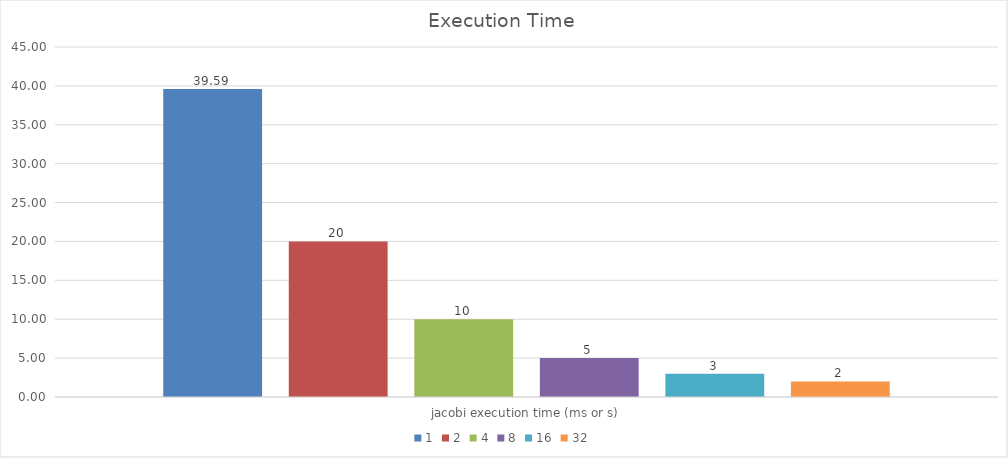
| Category | 1 | 2 | 4 | 8 | 16 | 32 |
|---|---|---|---|---|---|---|
| jacobi execution time (ms or s) | 39.59 | 20 | 10 | 5 | 3 | 2 |